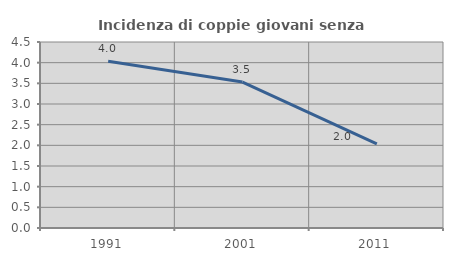
| Category | Incidenza di coppie giovani senza figli |
|---|---|
| 1991.0 | 4.037 |
| 2001.0 | 3.531 |
| 2011.0 | 2.035 |